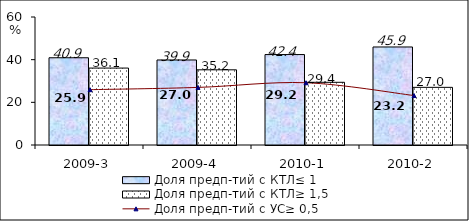
| Category | Доля предп-тий с КТЛ≤ 1 | Доля предп-тий с КТЛ≥ 1,5 |
|---|---|---|
| 2009-3 | 40.892 | 36.064 |
| 2009-4 | 39.855 | 35.243 |
| 2010-1 | 42.395 | 29.39 |
| 2010-2 | 45.95 | 27.025 |